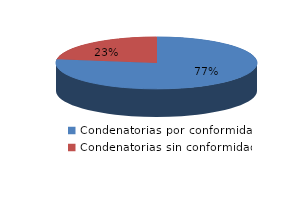
| Category | Series 0 |
|---|---|
| 0 | 88 |
| 1 | 26 |